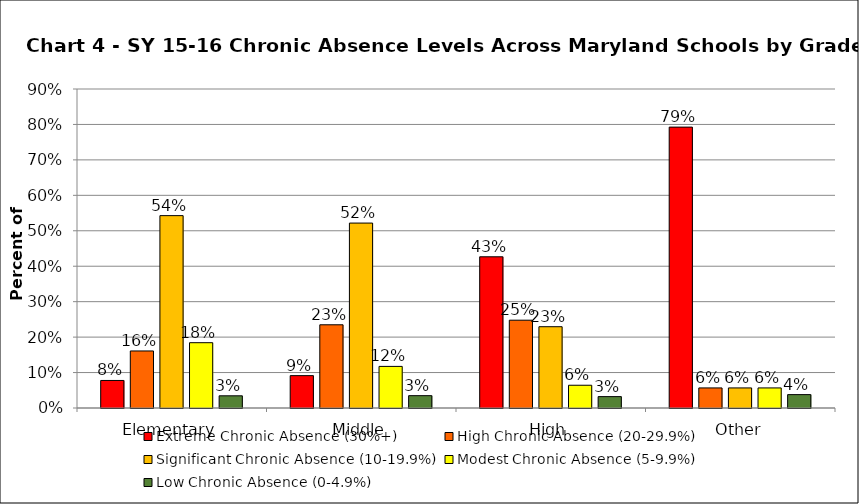
| Category | Extreme Chronic Absence (30%+) | High Chronic Absence (20-29.9%) | Significant Chronic Absence (10-19.9%) | Modest Chronic Absence (5-9.9%) | Low Chronic Absence (0-4.9%) |
|---|---|---|---|---|---|
| 0 | 0.078 | 0.161 | 0.543 | 0.184 | 0.034 |
| 1 | 0.091 | 0.235 | 0.522 | 0.117 | 0.035 |
| 2 | 0.427 | 0.248 | 0.229 | 0.064 | 0.032 |
| 3 | 0.792 | 0.057 | 0.057 | 0.057 | 0.038 |